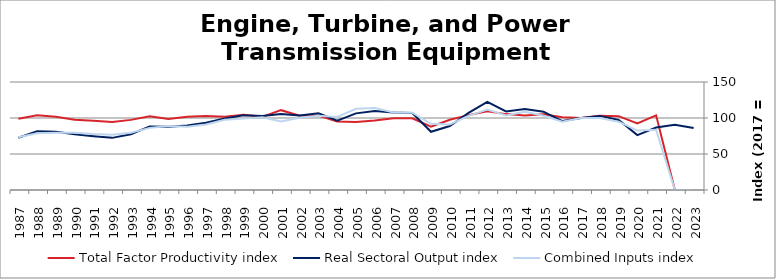
| Category | Total Factor Productivity index | Real Sectoral Output index | Combined Inputs index |
|---|---|---|---|
| 2023.0 | 0 | 86.019 | 0 |
| 2022.0 | 0 | 90.749 | 0 |
| 2021.0 | 103.775 | 86.834 | 83.676 |
| 2020.0 | 92.5 | 76.315 | 82.503 |
| 2019.0 | 102.548 | 97.28 | 94.862 |
| 2018.0 | 103.01 | 102.931 | 99.923 |
| 2017.0 | 100 | 100 | 100 |
| 2016.0 | 101.014 | 95.724 | 94.764 |
| 2015.0 | 105.262 | 108.658 | 103.226 |
| 2014.0 | 103.31 | 112.33 | 108.731 |
| 2013.0 | 105.389 | 109.131 | 103.551 |
| 2012.0 | 109.356 | 122.259 | 111.799 |
| 2011.0 | 104.007 | 107.089 | 102.963 |
| 2010.0 | 97.549 | 88.822 | 91.054 |
| 2009.0 | 87.849 | 80.812 | 91.99 |
| 2008.0 | 99.483 | 106.805 | 107.359 |
| 2007.0 | 99.805 | 107.565 | 107.775 |
| 2006.0 | 96.387 | 109.775 | 113.89 |
| 2005.0 | 94.416 | 106.433 | 112.728 |
| 2004.0 | 95.168 | 96.439 | 101.335 |
| 2003.0 | 103.442 | 106.561 | 103.015 |
| 2002.0 | 103.291 | 103.556 | 100.256 |
| 2001.0 | 110.873 | 105.573 | 95.219 |
| 2000.0 | 101.64 | 102.626 | 100.97 |
| 1999.0 | 104.611 | 103.701 | 99.129 |
| 1998.0 | 101.682 | 99.214 | 97.573 |
| 1997.0 | 102.717 | 93.478 | 91.006 |
| 1996.0 | 101.859 | 89.559 | 87.925 |
| 1995.0 | 98.585 | 87.781 | 89.04 |
| 1994.0 | 102.363 | 88.316 | 86.277 |
| 1993.0 | 97.404 | 77.455 | 79.519 |
| 1992.0 | 94.3 | 72.412 | 76.789 |
| 1991.0 | 96.307 | 74.77 | 77.637 |
| 1990.0 | 97.64 | 77.53 | 79.404 |
| 1989.0 | 101.809 | 80.959 | 79.52 |
| 1988.0 | 103.796 | 81.68 | 78.694 |
| 1987.0 | 99.076 | 72.635 | 73.312 |